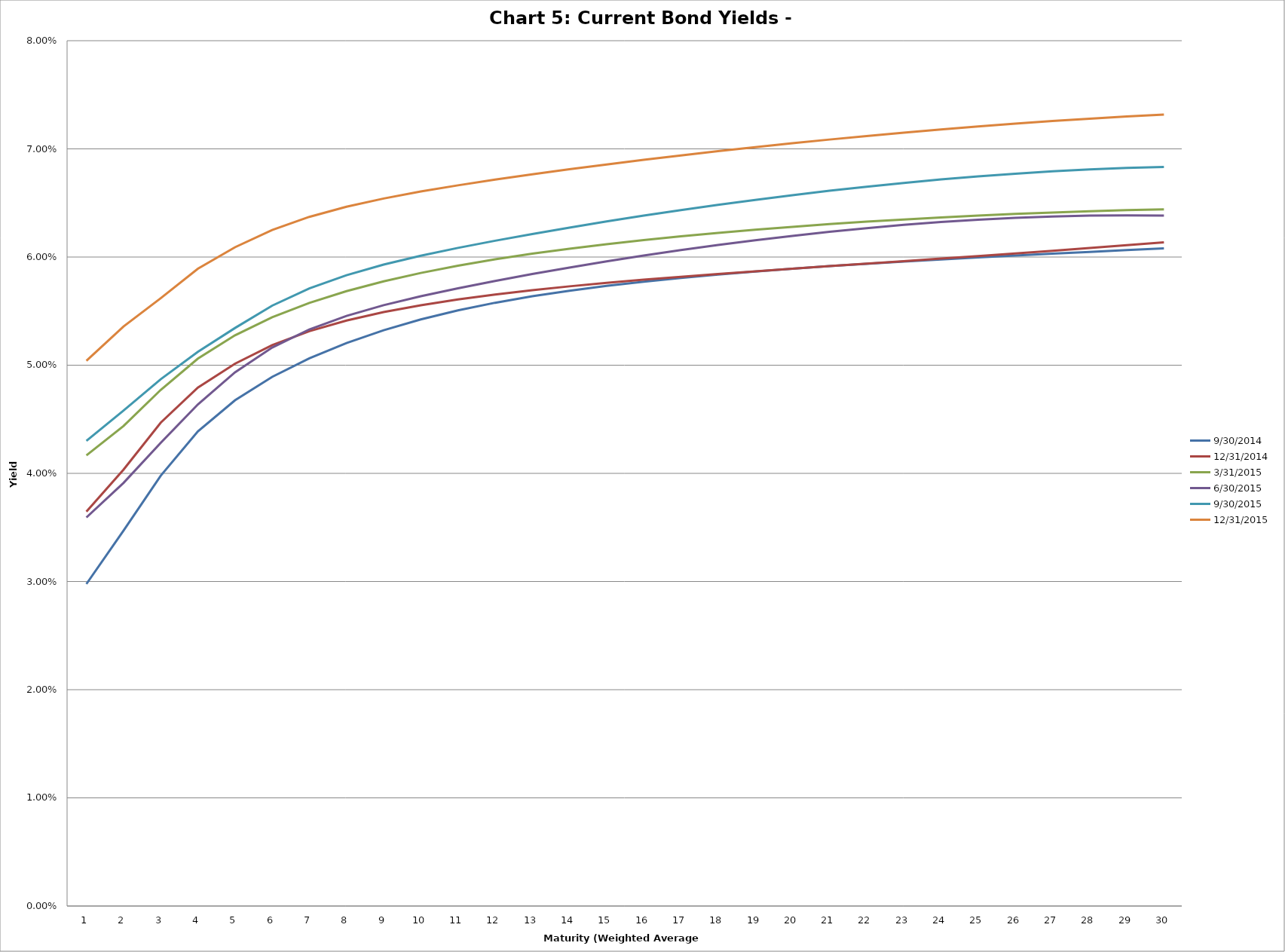
| Category | 9/30/2014 | 12/31/2014 | 3/31/2015 | 6/30/2015 | 9/30/2015 | 12/31/2015 |
|---|---|---|---|---|---|---|
| 0 | 0.03 | 0.036 | 0.042 | 0.036 | 0.043 | 0.05 |
| 1 | 0.035 | 0.04 | 0.044 | 0.039 | 0.046 | 0.054 |
| 2 | 0.04 | 0.045 | 0.048 | 0.043 | 0.049 | 0.056 |
| 3 | 0.044 | 0.048 | 0.051 | 0.046 | 0.051 | 0.059 |
| 4 | 0.047 | 0.05 | 0.053 | 0.049 | 0.053 | 0.061 |
| 5 | 0.049 | 0.052 | 0.054 | 0.052 | 0.056 | 0.063 |
| 6 | 0.051 | 0.053 | 0.056 | 0.053 | 0.057 | 0.064 |
| 7 | 0.052 | 0.054 | 0.057 | 0.055 | 0.058 | 0.065 |
| 8 | 0.053 | 0.055 | 0.058 | 0.056 | 0.059 | 0.065 |
| 9 | 0.054 | 0.056 | 0.059 | 0.056 | 0.06 | 0.066 |
| 10 | 0.055 | 0.056 | 0.059 | 0.057 | 0.061 | 0.067 |
| 11 | 0.056 | 0.057 | 0.06 | 0.058 | 0.062 | 0.067 |
| 12 | 0.056 | 0.057 | 0.06 | 0.058 | 0.062 | 0.068 |
| 13 | 0.057 | 0.057 | 0.061 | 0.059 | 0.063 | 0.068 |
| 14 | 0.057 | 0.058 | 0.061 | 0.06 | 0.063 | 0.069 |
| 15 | 0.058 | 0.058 | 0.062 | 0.06 | 0.064 | 0.069 |
| 16 | 0.058 | 0.058 | 0.062 | 0.061 | 0.064 | 0.069 |
| 17 | 0.058 | 0.058 | 0.062 | 0.061 | 0.065 | 0.07 |
| 18 | 0.059 | 0.059 | 0.063 | 0.062 | 0.065 | 0.07 |
| 19 | 0.059 | 0.059 | 0.063 | 0.062 | 0.066 | 0.071 |
| 20 | 0.059 | 0.059 | 0.063 | 0.062 | 0.066 | 0.071 |
| 21 | 0.059 | 0.059 | 0.063 | 0.063 | 0.067 | 0.071 |
| 22 | 0.06 | 0.06 | 0.063 | 0.063 | 0.067 | 0.071 |
| 23 | 0.06 | 0.06 | 0.064 | 0.063 | 0.067 | 0.072 |
| 24 | 0.06 | 0.06 | 0.064 | 0.063 | 0.067 | 0.072 |
| 25 | 0.06 | 0.06 | 0.064 | 0.064 | 0.068 | 0.072 |
| 26 | 0.06 | 0.061 | 0.064 | 0.064 | 0.068 | 0.073 |
| 27 | 0.06 | 0.061 | 0.064 | 0.064 | 0.068 | 0.073 |
| 28 | 0.061 | 0.061 | 0.064 | 0.064 | 0.068 | 0.073 |
| 29 | 0.061 | 0.061 | 0.064 | 0.064 | 0.068 | 0.073 |